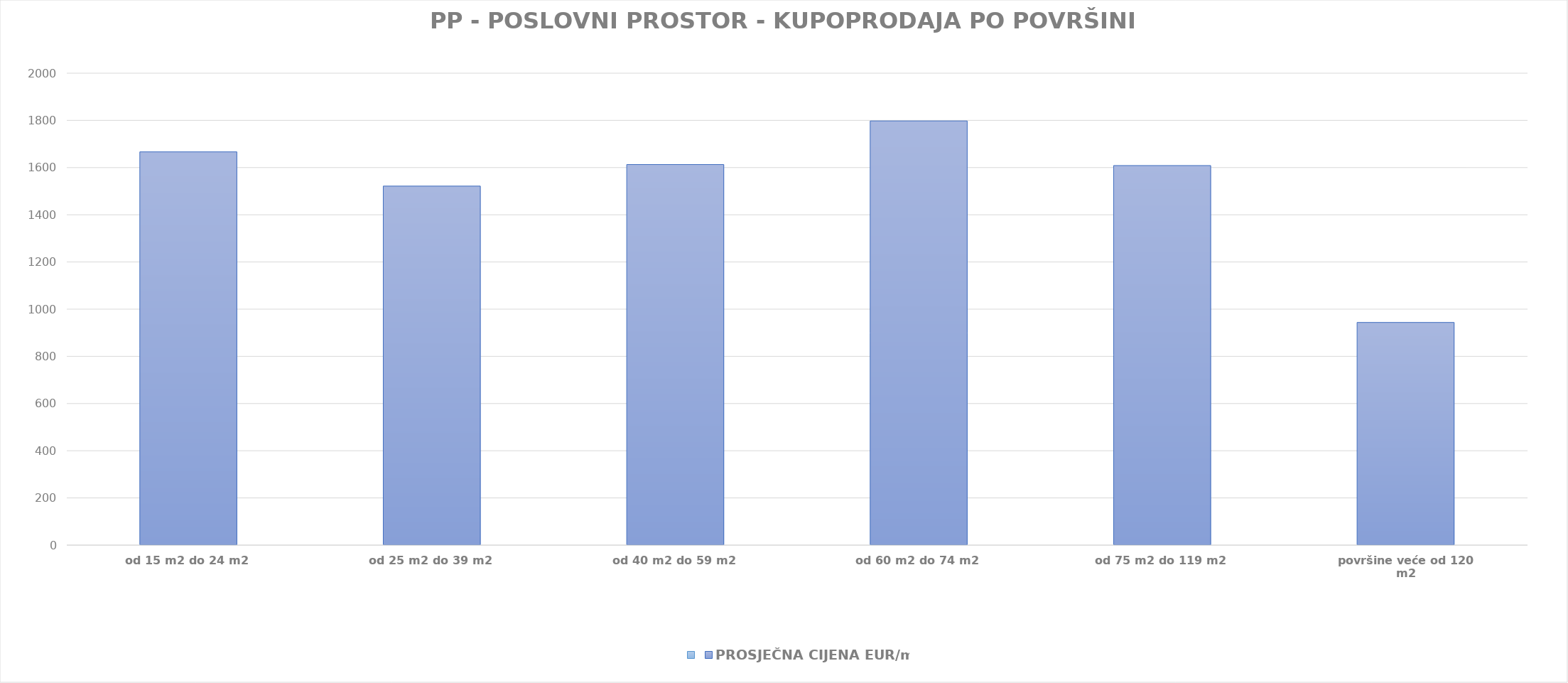
| Category | Series 0 | PROSJEČNA CIJENA EUR/m2 |
|---|---|---|
| od 15 m2 do 24 m2 |  | 1904-07-23 16:00:00 |
| od 25 m2 do 39 m2 |  | 1904-02-29 12:51:14 |
| od 40 m2 do 59 m2 |  | 1904-05-30 23:53:29 |
| od 60 m2 do 74 m2 |  | 1904-12-01 17:06:59 |
| od 75 m2 do 119 m2 |  | 1904-05-26 15:10:49 |
| površine veće od 120 m2 |  | 1902-07-31 16:31:14 |